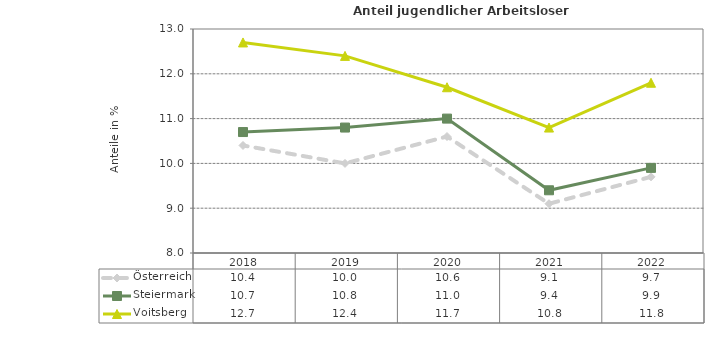
| Category | Österreich | Steiermark | Voitsberg |
|---|---|---|---|
| 2022.0 | 9.7 | 9.9 | 11.8 |
| 2021.0 | 9.1 | 9.4 | 10.8 |
| 2020.0 | 10.6 | 11 | 11.7 |
| 2019.0 | 10 | 10.8 | 12.4 |
| 2018.0 | 10.4 | 10.7 | 12.7 |